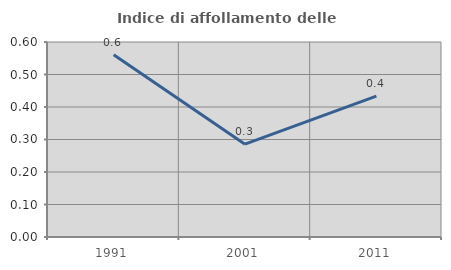
| Category | Indice di affollamento delle abitazioni  |
|---|---|
| 1991.0 | 0.561 |
| 2001.0 | 0.286 |
| 2011.0 | 0.433 |